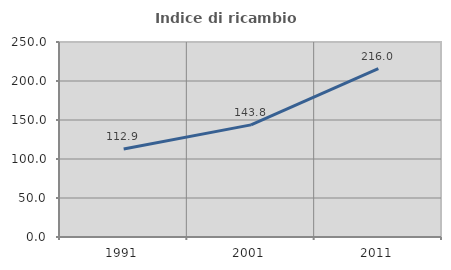
| Category | Indice di ricambio occupazionale  |
|---|---|
| 1991.0 | 112.917 |
| 2001.0 | 143.75 |
| 2011.0 | 215.986 |